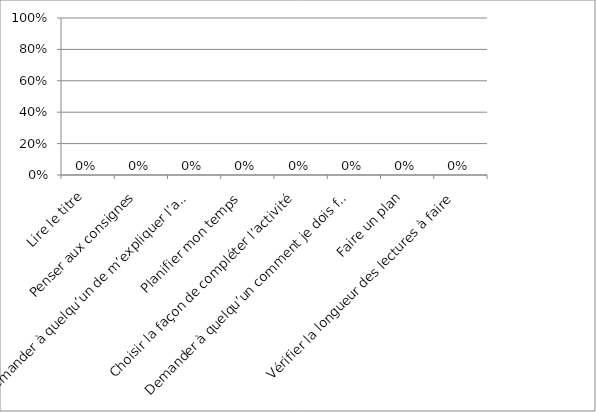
| Category | Series 0 |
|---|---|
| Lire le titre | 0 |
| Penser aux consignes | 0 |
| Demander à quelqu’un de m’expliquer l’activité | 0 |
| Planifier mon temps  | 0 |
| Choisir la façon de compléter l’activité | 0 |
| Demander à quelqu’un comment je dois faire la tâche | 0 |
| Faire un plan | 0 |
| Vérifier la longueur des lectures à faire | 0 |